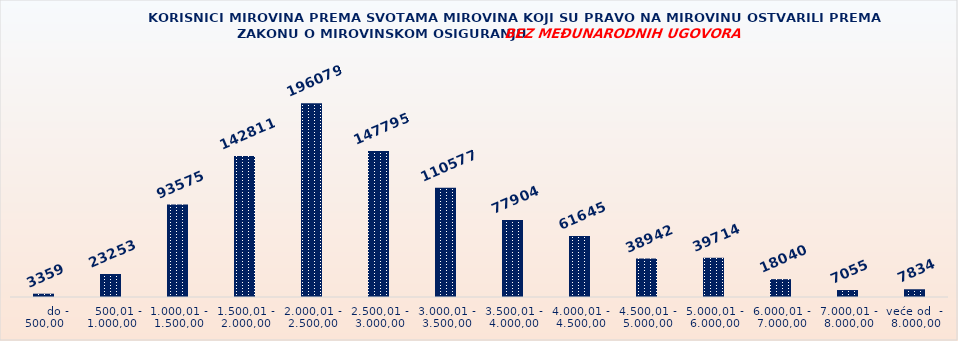
| Category | KORISNICI MIROVINA PREMA VRSTAMA I SVOTAMA MIROVINA KOJI SU PRAVO NA MIROVINU OSTVARILI PREMA ZAKONU O MIROVINSKOM OSIGURANJU 
BEZ MEĐUNARODNIH UGOVORA |
|---|---|
|       do - 500,00 | 3359 |
|    500,01 - 1.000,00 | 23253 |
| 1.000,01 - 1.500,00 | 93575 |
| 1.500,01 - 2.000,00 | 142811 |
| 2.000,01 - 2.500,00 | 196079 |
| 2.500,01 - 3.000,00 | 147795 |
| 3.000,01 - 3.500,00 | 110577 |
| 3.500,01 - 4.000,00 | 77904 |
| 4.000,01 - 4.500,00 | 61645 |
| 4.500,01 - 5.000,00 | 38942 |
| 5.000,01 - 6.000,00 | 39714 |
| 6.000,01 - 7.000,00 | 18040 |
| 7.000,01 - 8.000,00 | 7055 |
| veće od  -  8.000,00 | 7834 |